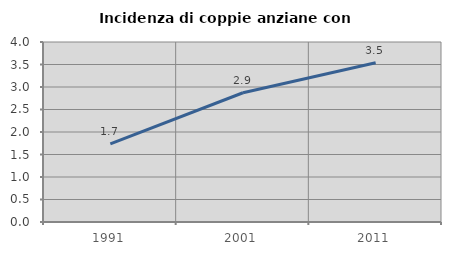
| Category | Incidenza di coppie anziane con figli |
|---|---|
| 1991.0 | 1.735 |
| 2001.0 | 2.872 |
| 2011.0 | 3.538 |